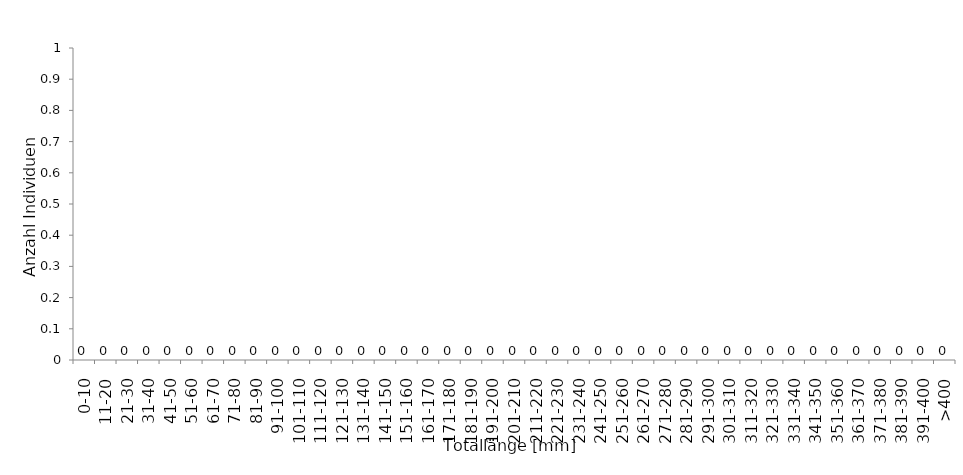
| Category | Series 0 |
|---|---|
| 0-10 | 0 |
|  11-20 | 0 |
| 21-30 | 0 |
| 31-40 | 0 |
| 41-50 | 0 |
| 51-60 | 0 |
| 61-70 | 0 |
| 71-80 | 0 |
| 81-90 | 0 |
| 91-100 | 0 |
| 101-110 | 0 |
| 111-120 | 0 |
| 121-130 | 0 |
| 131-140 | 0 |
| 141-150 | 0 |
| 151-160 | 0 |
| 161-170 | 0 |
| 171-180 | 0 |
| 181-190 | 0 |
| 191-200 | 0 |
| 201-210 | 0 |
| 211-220 | 0 |
| 221-230 | 0 |
| 231-240 | 0 |
| 241-250 | 0 |
| 251-260 | 0 |
| 261-270 | 0 |
| 271-280 | 0 |
| 281-290 | 0 |
| 291-300 | 0 |
| 301-310 | 0 |
| 311-320 | 0 |
| 321-330 | 0 |
| 331-340 | 0 |
| 341-350 | 0 |
| 351-360 | 0 |
| 361-370 | 0 |
| 371-380 | 0 |
| 381-390 | 0 |
| 391-400 | 0 |
| >400 | 0 |